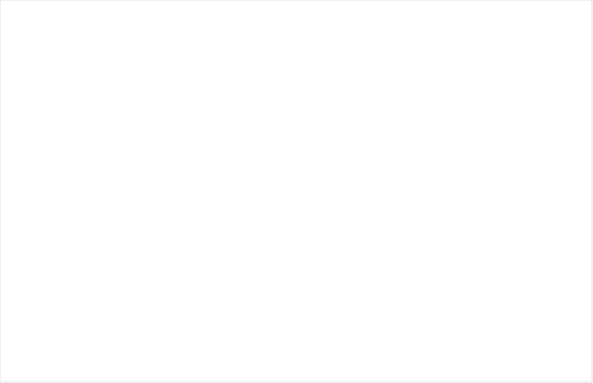
| Category | Suma de CXP CONSTITUIDAS
(1) | Suma de CANCELACIONES CXP
 (2) | Suma de TOTAL PAGOS
ACUMULADOS
(5) |
|---|---|---|---|
| Total | 8076.214 | 0 | 7040.869 |